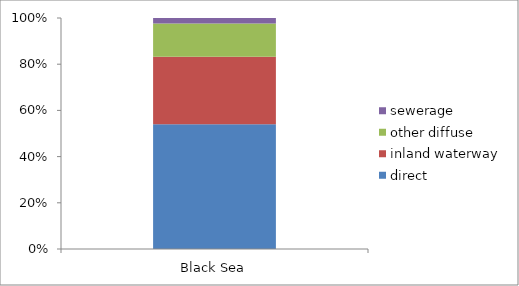
| Category | direct | inland waterway | other diffuse | sewerage |
|---|---|---|---|---|
| Black Sea | 19546.5 | 10535.75 | 5202.5 | 880.25 |